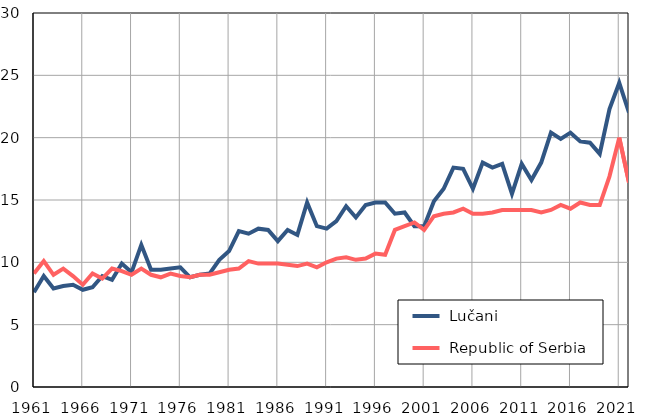
| Category |  Lučani |  Republic of Serbia |
|---|---|---|
| 1961.0 | 7.6 | 9.1 |
| 1962.0 | 8.9 | 10.1 |
| 1963.0 | 7.9 | 9 |
| 1964.0 | 8.1 | 9.5 |
| 1965.0 | 8.2 | 8.9 |
| 1966.0 | 7.8 | 8.2 |
| 1967.0 | 8 | 9.1 |
| 1968.0 | 8.9 | 8.7 |
| 1969.0 | 8.6 | 9.5 |
| 1970.0 | 9.9 | 9.3 |
| 1971.0 | 9.2 | 9 |
| 1972.0 | 11.4 | 9.5 |
| 1973.0 | 9.4 | 9 |
| 1974.0 | 9.4 | 8.8 |
| 1975.0 | 9.5 | 9.1 |
| 1976.0 | 9.6 | 8.9 |
| 1977.0 | 8.8 | 8.8 |
| 1978.0 | 9 | 9 |
| 1979.0 | 9.1 | 9 |
| 1980.0 | 10.2 | 9.2 |
| 1981.0 | 10.9 | 9.4 |
| 1982.0 | 12.5 | 9.5 |
| 1983.0 | 12.3 | 10.1 |
| 1984.0 | 12.7 | 9.9 |
| 1985.0 | 12.6 | 9.9 |
| 1986.0 | 11.7 | 9.9 |
| 1987.0 | 12.6 | 9.8 |
| 1988.0 | 12.2 | 9.7 |
| 1989.0 | 14.8 | 9.9 |
| 1990.0 | 12.9 | 9.6 |
| 1991.0 | 12.7 | 10 |
| 1992.0 | 13.3 | 10.3 |
| 1993.0 | 14.5 | 10.4 |
| 1994.0 | 13.6 | 10.2 |
| 1995.0 | 14.6 | 10.3 |
| 1996.0 | 14.8 | 10.7 |
| 1997.0 | 14.8 | 10.6 |
| 1998.0 | 13.9 | 12.6 |
| 1999.0 | 14 | 12.9 |
| 2000.0 | 12.9 | 13.2 |
| 2001.0 | 12.9 | 12.6 |
| 2002.0 | 14.9 | 13.7 |
| 2003.0 | 15.9 | 13.9 |
| 2004.0 | 17.6 | 14 |
| 2005.0 | 17.5 | 14.3 |
| 2006.0 | 15.9 | 13.9 |
| 2007.0 | 18 | 13.9 |
| 2008.0 | 17.6 | 14 |
| 2009.0 | 17.9 | 14.2 |
| 2010.0 | 15.5 | 14.2 |
| 2011.0 | 17.9 | 14.2 |
| 2012.0 | 16.6 | 14.2 |
| 2013.0 | 18 | 14 |
| 2014.0 | 20.4 | 14.2 |
| 2015.0 | 19.9 | 14.6 |
| 2016.0 | 20.4 | 14.3 |
| 2017.0 | 19.7 | 14.8 |
| 2018.0 | 19.6 | 14.6 |
| 2019.0 | 18.7 | 14.6 |
| 2020.0 | 22.3 | 16.9 |
| 2021.0 | 24.4 | 20 |
| 2022.0 | 22 | 16.4 |